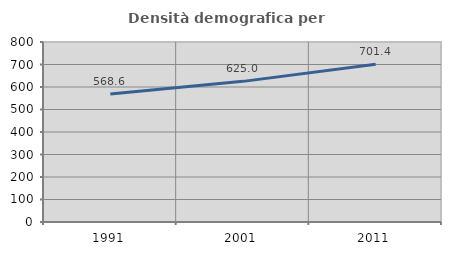
| Category | Densità demografica |
|---|---|
| 1991.0 | 568.552 |
| 2001.0 | 625.047 |
| 2011.0 | 701.368 |